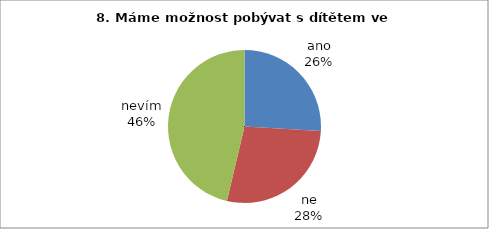
| Category | 8. |
|---|---|
| ano | 14 |
| ne | 15 |
| nevím | 25 |